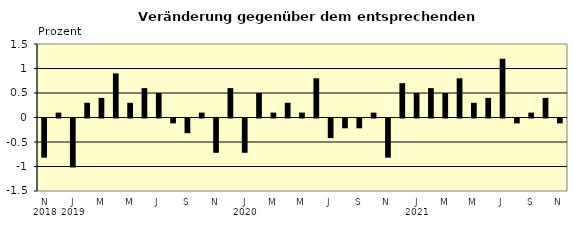
| Category | Series 0 |
|---|---|
| 0 | -0.8 |
| 1 | 0.1 |
| 2 | -1 |
| 3 | 0.3 |
| 4 | 0.4 |
| 5 | 0.9 |
| 6 | 0.3 |
| 7 | 0.6 |
| 8 | 0.5 |
| 9 | -0.1 |
| 10 | -0.3 |
| 11 | 0.1 |
| 12 | -0.7 |
| 13 | 0.6 |
| 14 | -0.7 |
| 15 | 0.5 |
| 16 | 0.1 |
| 17 | 0.3 |
| 18 | 0.1 |
| 19 | 0.8 |
| 20 | -0.4 |
| 21 | -0.2 |
| 22 | -0.2 |
| 23 | 0.1 |
| 24 | -0.8 |
| 25 | 0.7 |
| 26 | 0.5 |
| 27 | 0.6 |
| 28 | 0.5 |
| 29 | 0.8 |
| 30 | 0.3 |
| 31 | 0.4 |
| 32 | 1.2 |
| 33 | -0.1 |
| 34 | 0.1 |
| 35 | 0.4 |
| 36 | -0.1 |